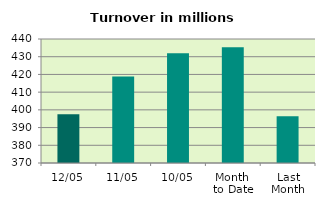
| Category | Series 0 |
|---|---|
| 12/05 | 397.553 |
| 11/05 | 418.776 |
| 10/05 | 431.966 |
| Month 
to Date | 435.301 |
| Last
Month | 396.429 |